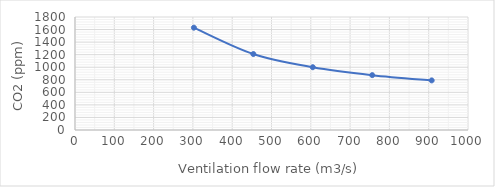
| Category | Series 0 |
|---|---|
| 302.5210084033613 | 1630 |
| 453.781512605042 | 1210 |
| 605.0420168067226 | 1000 |
| 756.3025210084032 | 874 |
| 907.563025210084 | 790 |